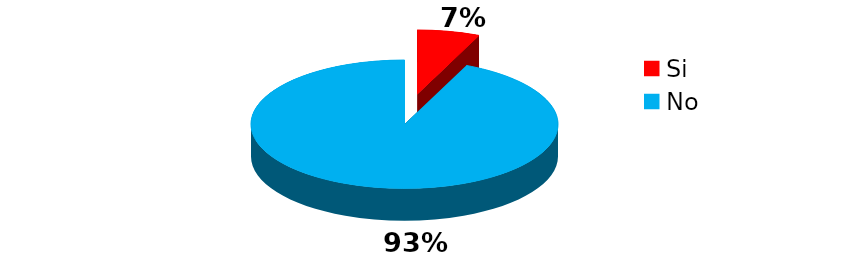
| Category | Series 0 |
|---|---|
| Si | 13 |
| No | 184 |